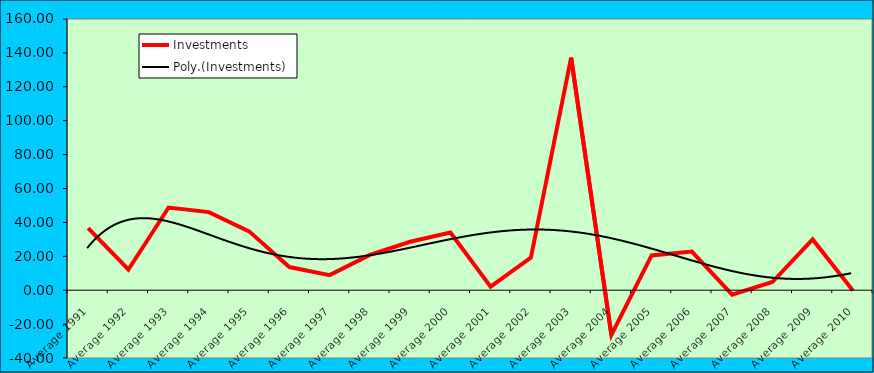
| Category | Investments |
|---|---|
| Average 1991 | 36.683 |
| Average 1992 | 12.209 |
| Average 1993 | 48.777 |
| Average 1994 | 46.063 |
| Average 1995 | 34.736 |
| Average 1996 | 13.672 |
| Average 1997 | 8.884 |
| Average 1998 | 20.857 |
| Average 1999 | 28.594 |
| Average 2000 | 34.046 |
| Average 2001 | 2.088 |
| Average 2002 | 19.247 |
| Average 2003 | 137.214 |
| Average 2004 | -26.351 |
| Average 2005 | 20.491 |
| Average 2006 | 22.753 |
| Average 2007 | -2.64 |
| Average 2008 | 4.831 |
| Average 2009 | 29.968 |
| Average 2010 | -0.178 |